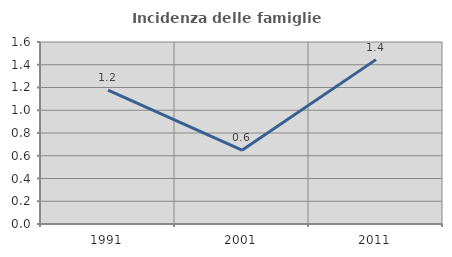
| Category | Incidenza delle famiglie numerose |
|---|---|
| 1991.0 | 1.177 |
| 2001.0 | 0.649 |
| 2011.0 | 1.445 |